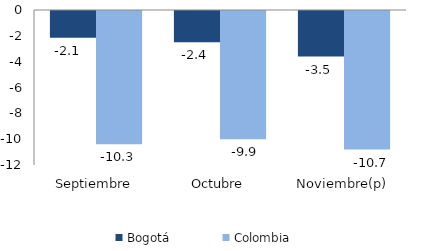
| Category | Bogotá | Colombia |
|---|---|---|
| Septiembre | -2.075 | -10.308 |
| Octubre | -2.424 | -9.929 |
| Noviembre(p) | -3.523 | -10.726 |